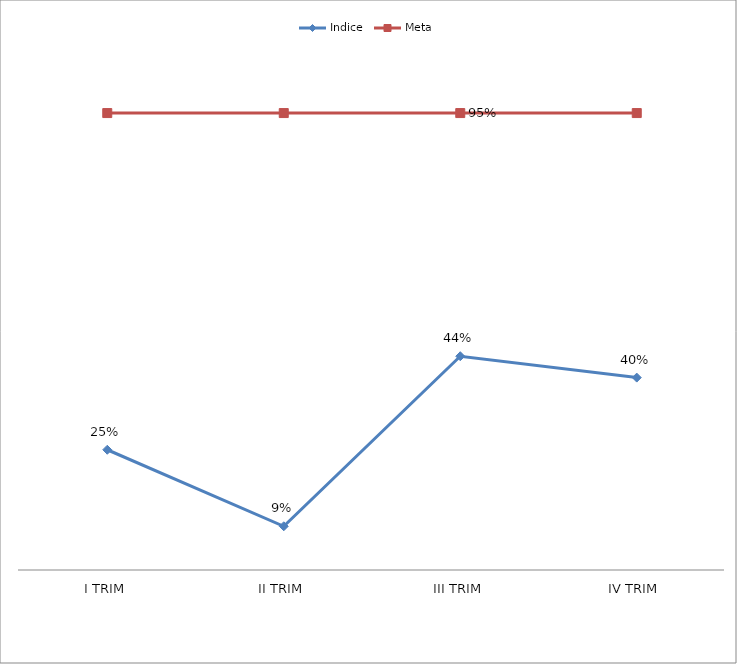
| Category | Indice | Meta |
|---|---|---|
| I TRIM | 0.25 | 0.95 |
| II TRIM | 0.091 | 0.95 |
| III TRIM | 0.444 | 0.95 |
| IV TRIM | 0.4 | 0.95 |